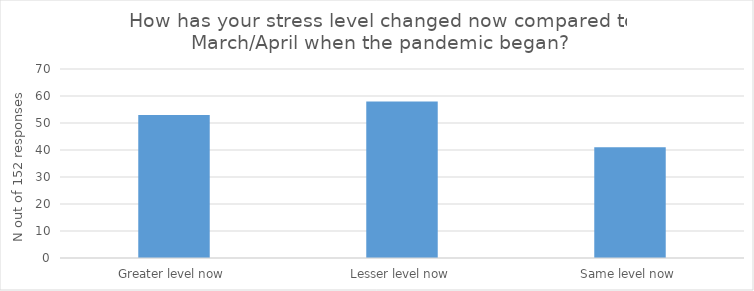
| Category | N out of 152 respnses |
|---|---|
| Greater level now | 53 |
| Lesser level now | 58 |
| Same level now | 41 |